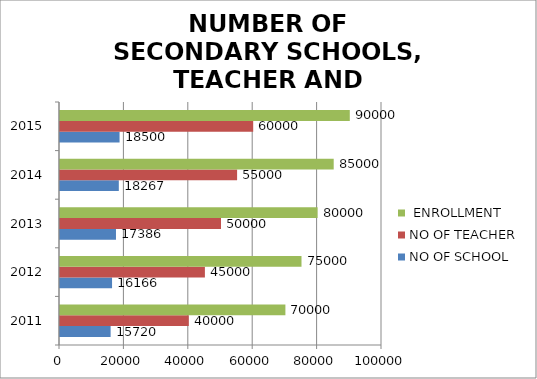
| Category | NO OF SCHOOL | NO OF TEACHER |  ENROLLMENT |
|---|---|---|---|
| 2011.0 | 15720 | 40000 | 70000 |
| 2012.0 | 16166 | 45000 | 75000 |
| 2013.0 | 17386 | 50000 | 80000 |
| 2014.0 | 18267 | 55000 | 85000 |
| 2015.0 | 18500 | 60000 | 90000 |